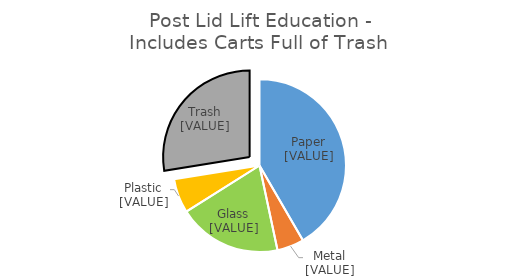
| Category | Series 0 |
|---|---|
| Paper | 0.416 |
| Metals | 0.05 |
| Glass | 0.194 |
| Plastic | 0.064 |
| Trash  | 0.275 |